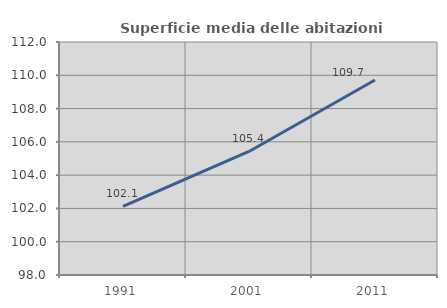
| Category | Superficie media delle abitazioni occupate |
|---|---|
| 1991.0 | 102.121 |
| 2001.0 | 105.423 |
| 2011.0 | 109.713 |